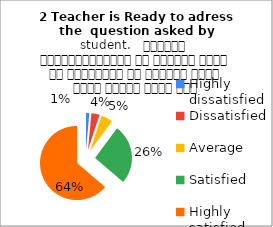
| Category | 2 Teacher is Ready to adress the  question asked by student.   शिक्षक विद्यार्थियों के द्वारा पूछे गए प्रश्नों का समाधान करने हेतु तत्पर रहते हैं |
|---|---|
| Highly dissatisfied | 4 |
| Dissatisfied | 10 |
| Average | 14 |
| Satisfied | 72 |
| Highly satisfied | 176 |